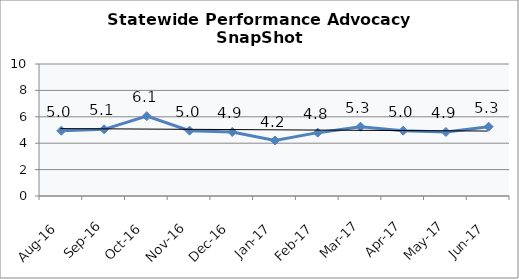
| Category | Statewide |
|---|---|
| Aug-16 | 4.95 |
| Sep-16 | 5.05 |
| Oct-16 | 6.05 |
| Nov-16 | 4.95 |
| Dec-16 | 4.85 |
| Jan-17 | 4.2 |
| Feb-17 | 4.8 |
| Mar-17 | 5.25 |
| Apr-17 | 4.95 |
| May-17 | 4.85 |
| Jun-17 | 5.25 |